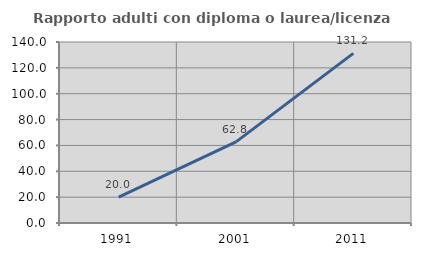
| Category | Rapporto adulti con diploma o laurea/licenza media  |
|---|---|
| 1991.0 | 20 |
| 2001.0 | 62.766 |
| 2011.0 | 131.169 |